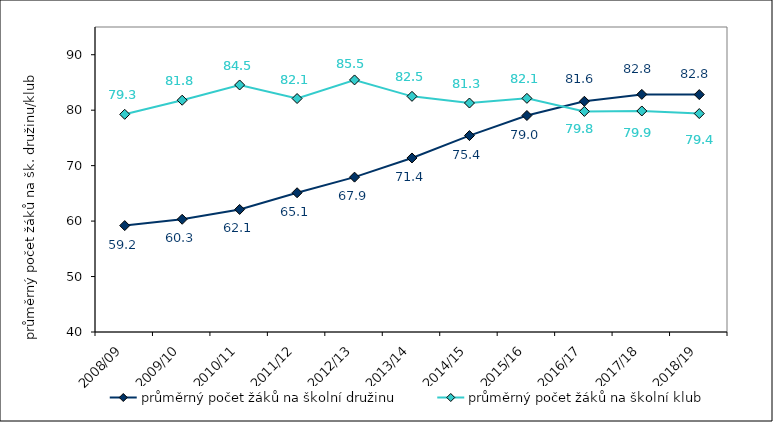
| Category | průměrný počet žáků na školní družinu | průměrný počet žáků na školní klub |
|---|---|---|
| 2008/09 | 59.189 | 79.253 |
| 2009/10 | 60.331 | 81.796 |
| 2010/11 | 62.099 | 84.546 |
| 2011/12 | 65.113 | 82.101 |
| 2012/13 | 67.925 | 85.456 |
| 2013/14 | 71.383 | 82.494 |
| 2014/15 | 75.422 | 81.292 |
| 2015/16 | 79.04 | 82.133 |
| 2016/17 | 81.605 | 79.778 |
| 2017/18 | 82.848 | 79.858 |
| 2018/19 | 82.813 | 79.391 |